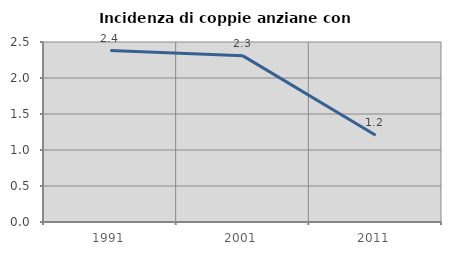
| Category | Incidenza di coppie anziane con figli |
|---|---|
| 1991.0 | 2.381 |
| 2001.0 | 2.308 |
| 2011.0 | 1.205 |